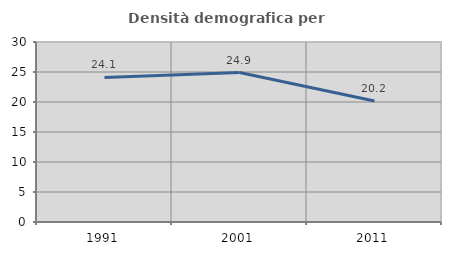
| Category | Densità demografica |
|---|---|
| 1991.0 | 24.084 |
| 2001.0 | 24.903 |
| 2011.0 | 20.152 |